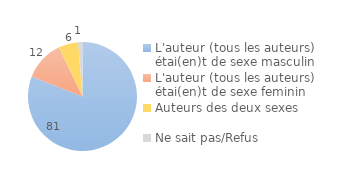
| Category | Series 0 |
|---|---|
| L'auteur (tous les auteurs) étai(en)t de sexe masculin | 80.951 |
| L'auteur (tous les auteurs) étai(en)t de sexe feminin | 11.943 |
| Auteurs des deux sexes | 5.843 |
| Ne sait pas/Refus | 1.263 |